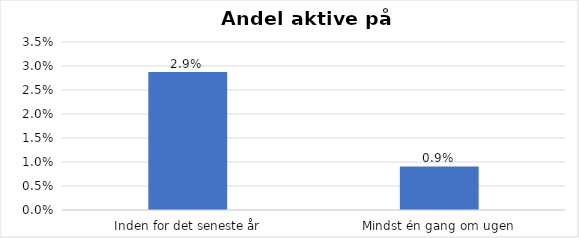
| Category | % |
|---|---|
| Inden for det seneste år | 0.029 |
| Mindst én gang om ugen | 0.009 |